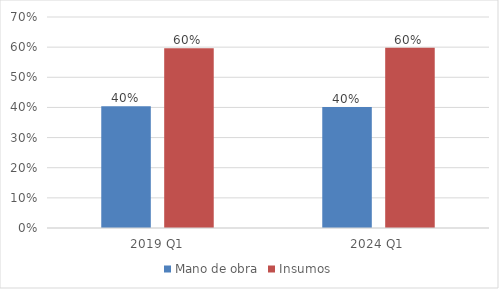
| Category | Mano de obra | Insumos |
|---|---|---|
| 2019 Q1 | 0.404 | 0.596 |
| 2024 Q1 | 0.402 | 0.598 |